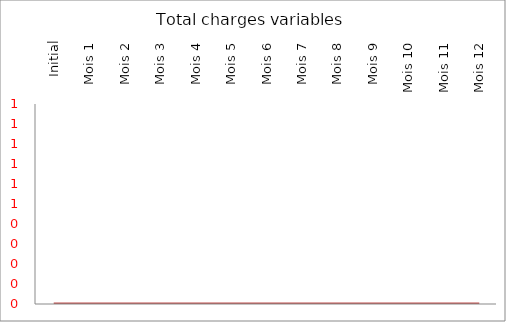
| Category | Total charges variables |
|---|---|
| Initial | 0 |
| Mois 1 | 0 |
| Mois 2 | 0 |
| Mois 3 | 0 |
| Mois 4 | 0 |
| Mois 5 | 0 |
| Mois 6 | 0 |
| Mois 7 | 0 |
| Mois 8 | 0 |
| Mois 9 | 0 |
| Mois 10 | 0 |
| Mois 11 | 0 |
| Mois 12 | 0 |